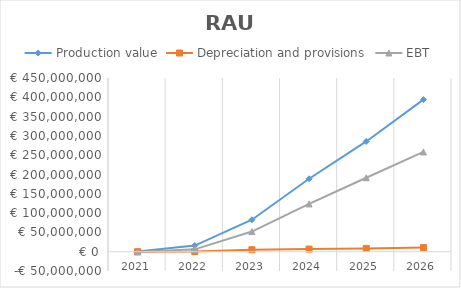
| Category | Production value | Depreciation and provisions | EBT |
|---|---|---|---|
| 2021.0 | 618333.333 | 59895.437 | -613063.639 |
| 2022.0 | 15868382.26 | 468837.533 | 6106333.747 |
| 2023.0 | 82763830.721 | 5061601.32 | 52182134.564 |
| 2024.0 | 189014250.595 | 6790070.9 | 123765954.963 |
| 2025.0 | 285641648.761 | 8528714.74 | 191542275.238 |
| 2026.0 | 394048244.625 | 10742809.28 | 258393989.01 |